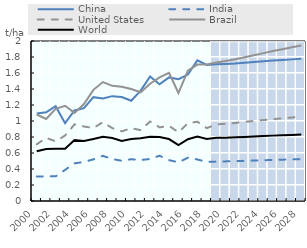
| Category | Projected1 | Projected2 | Projected3 | Projected4 | Projected5 | Projected6 | Projected7 | Projected8 | Projected9 | Projected10 |
|---|---|---|---|---|---|---|---|---|---|---|
| 2000.0 | 0 | 0 | 0 | 0 | 0 | 0 | 0 | 0 | 0 | 0 |
| 2001.0 | 0 | 0 | 0 | 0 | 0 | 0 | 0 | 0 | 0 | 0 |
| 2002.0 | 0 | 0 | 0 | 0 | 0 | 0 | 0 | 0 | 0 | 0 |
| 2003.0 | 0 | 0 | 0 | 0 | 0 | 0 | 0 | 0 | 0 | 0 |
| 2004.0 | 0 | 0 | 0 | 0 | 0 | 0 | 0 | 0 | 0 | 0 |
| 2005.0 | 0 | 0 | 0 | 0 | 0 | 0 | 0 | 0 | 0 | 0 |
| 2006.0 | 0 | 0 | 0 | 0 | 0 | 0 | 0 | 0 | 0 | 0 |
| 2007.0 | 0 | 0 | 0 | 0 | 0 | 0 | 0 | 0 | 0 | 0 |
| 2008.0 | 0 | 0 | 0 | 0 | 0 | 0 | 0 | 0 | 0 | 0 |
| 2009.0 | 0 | 0 | 0 | 0 | 0 | 0 | 0 | 0 | 0 | 0 |
| 2010.0 | 0 | 0 | 0 | 0 | 0 | 0 | 0 | 0 | 0 | 0 |
| 2011.0 | 0 | 0 | 0 | 0 | 0 | 0 | 0 | 0 | 0 | 0 |
| 2012.0 | 0 | 0 | 0 | 0 | 0 | 0 | 0 | 0 | 0 | 0 |
| 2013.0 | 0 | 0 | 0 | 0 | 0 | 0 | 0 | 0 | 0 | 0 |
| 2014.0 | 0 | 0 | 0 | 0 | 0 | 0 | 0 | 0 | 0 | 0 |
| 2015.0 | 0 | 0 | 0 | 0 | 0 | 0 | 0 | 0 | 0 | 0 |
| 2016.0 | 0 | 0 | 0 | 0 | 0 | 0 | 0 | 0 | 0 | 0 |
| 2017.0 | 0 | 0 | 0 | 0 | 0 | 0 | 0 | 0 | 0 | 0 |
| 2018.0 | 0 | 0 | 0 | 0 | 0 | 0 | 0 | 0 | 0 | 0 |
| 2019.0 | 1 | 1 | 1 | 1 | 1 | 1 | 1 | 1 | 1 | 0.95 |
| 2020.0 | 1 | 1 | 1 | 1 | 1 | 1 | 1 | 1 | 1 | 0.95 |
| 2021.0 | 1 | 1 | 1 | 1 | 1 | 1 | 1 | 1 | 1 | 0.95 |
| 2022.0 | 1 | 1 | 1 | 1 | 1 | 1 | 1 | 1 | 1 | 0.95 |
| 2023.0 | 1 | 1 | 1 | 1 | 1 | 1 | 1 | 1 | 1 | 0.95 |
| 2024.0 | 1 | 1 | 1 | 1 | 1 | 1 | 1 | 1 | 1 | 0.95 |
| 2025.0 | 1 | 1 | 1 | 1 | 1 | 1 | 1 | 1 | 1 | 0.95 |
| 2026.0 | 1 | 1 | 1 | 1 | 1 | 1 | 1 | 1 | 1 | 0.95 |
| 2027.0 | 1 | 1 | 1 | 1 | 1 | 1 | 1 | 1 | 1 | 0.95 |
| 2028.0 | 1 | 1 | 1 | 1 | 1 | 1 | 1 | 1 | 1 | 0.95 |